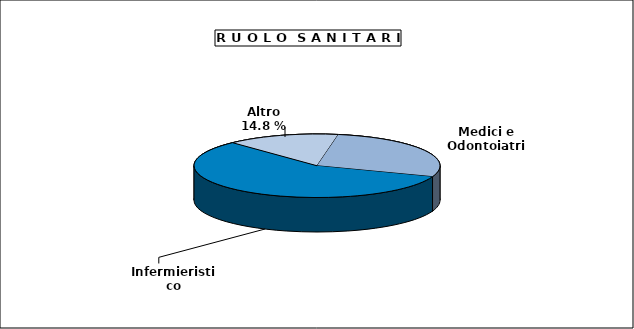
| Category | Personale Sanitario |
|---|---|
| Medici e Odontoiatri | 17420 |
| Infermieristico | 35946 |
| Altro | 9295 |